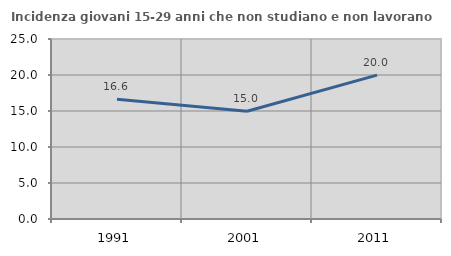
| Category | Incidenza giovani 15-29 anni che non studiano e non lavorano  |
|---|---|
| 1991.0 | 16.643 |
| 2001.0 | 14.96 |
| 2011.0 | 19.977 |